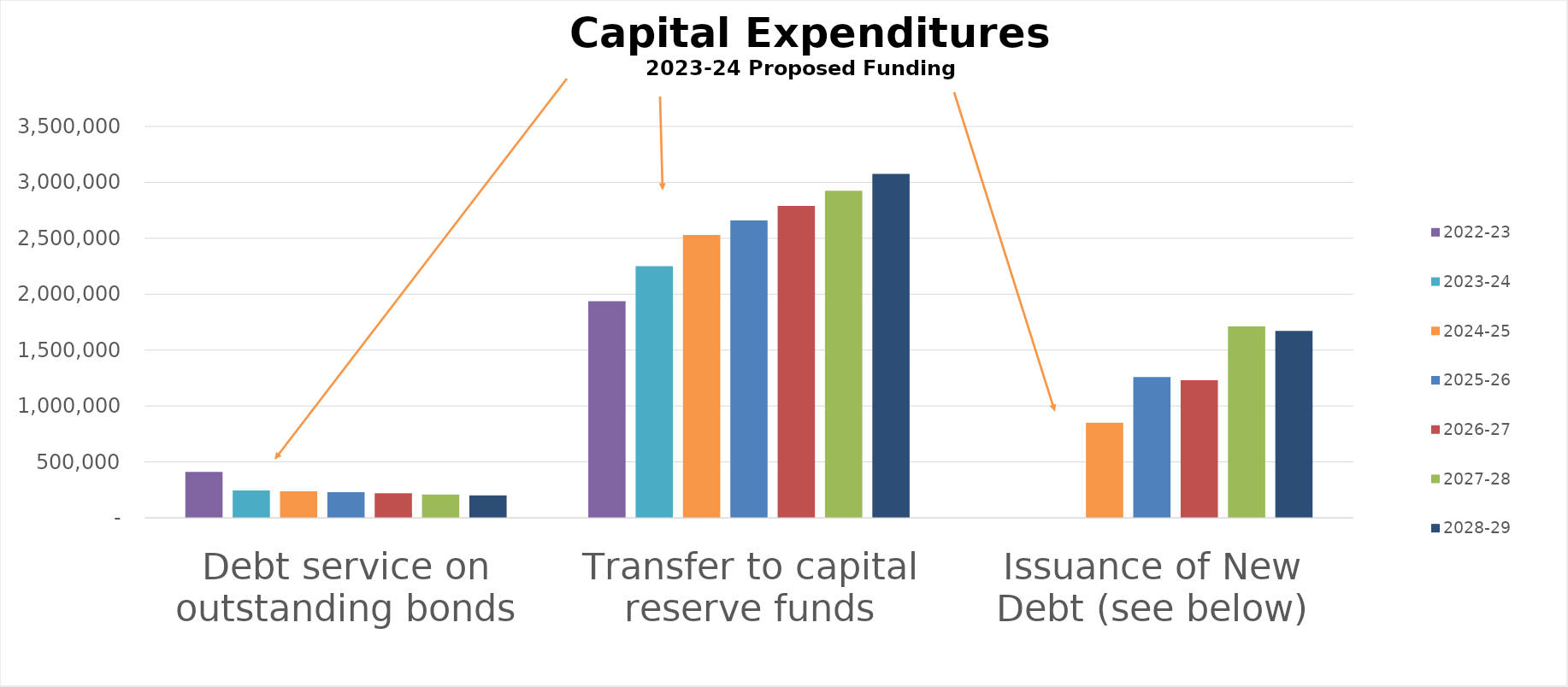
| Category | 2022-23 | 2023-24 | 2024-25 | 2025-26 | 2026-27 | 2027-28 | 2028-29 |
|---|---|---|---|---|---|---|---|
| Debt service on outstanding bonds | 410731 | 244145 | 236240 | 228335 | 220430 | 207525 | 199875 |
| Transfer to capital reserve funds | 1937250 | 2250000 | 2530000 | 2660000 | 2790000 | 2925000 | 3075000 |
| Issuance of New Debt (see below) | 0 | 0 | 850000 | 1259950 | 1230856 | 1711760 | 1671866 |